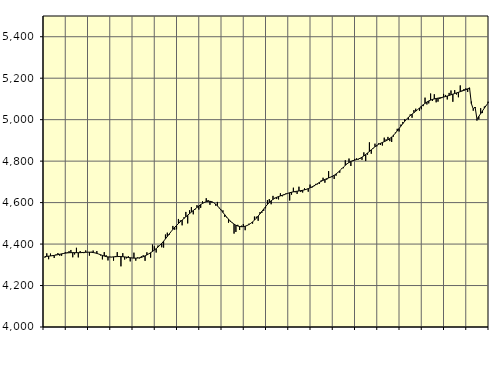
| Category | Piggar | Series 1 |
|---|---|---|
| nan | 4334.2 | 4339.69 |
| 1.0 | 4355.4 | 4340.64 |
| 1.0 | 4326.9 | 4341.66 |
| 1.0 | 4354.1 | 4342.77 |
| 1.0 | 4346.4 | 4343.97 |
| 1.0 | 4333.1 | 4345.29 |
| 1.0 | 4349.9 | 4347.05 |
| 1.0 | 4356.6 | 4348.73 |
| 1.0 | 4343.8 | 4350.78 |
| 1.0 | 4343.7 | 4352.78 |
| 1.0 | 4356.4 | 4354.63 |
| 1.0 | 4361.3 | 4356.15 |
| nan | 4360.5 | 4357.28 |
| 2.0 | 4365.7 | 4358.07 |
| 2.0 | 4371.5 | 4358.52 |
| 2.0 | 4336.2 | 4358.7 |
| 2.0 | 4349.8 | 4358.64 |
| 2.0 | 4382 | 4358.5 |
| 2.0 | 4335.7 | 4358.42 |
| 2.0 | 4366 | 4358.53 |
| 2.0 | 4361 | 4358.98 |
| 2.0 | 4356.2 | 4359.68 |
| 2.0 | 4369.2 | 4360.35 |
| 2.0 | 4361.3 | 4360.81 |
| nan | 4344.3 | 4360.84 |
| 3.0 | 4362.8 | 4360.28 |
| 3.0 | 4368.7 | 4359.13 |
| 3.0 | 4356.9 | 4357.38 |
| 3.0 | 4366.3 | 4355 |
| 3.0 | 4351.8 | 4352 |
| 3.0 | 4345 | 4348.61 |
| 3.0 | 4326.1 | 4345.21 |
| 3.0 | 4361.1 | 4342.1 |
| 3.0 | 4346.4 | 4339.65 |
| 3.0 | 4321 | 4338.04 |
| 3.0 | 4338.7 | 4337.37 |
| nan | 4336.6 | 4337.59 |
| 4.0 | 4319.8 | 4338.27 |
| 4.0 | 4342.5 | 4339.05 |
| 4.0 | 4361.2 | 4339.65 |
| 4.0 | 4338.8 | 4339.91 |
| 4.0 | 4292.6 | 4339.68 |
| 4.0 | 4356.1 | 4339.01 |
| 4.0 | 4325.3 | 4338.06 |
| 4.0 | 4331.2 | 4336.82 |
| 4.0 | 4341.5 | 4335.35 |
| 4.0 | 4316.5 | 4334.06 |
| 4.0 | 4332.6 | 4333.02 |
| nan | 4358.5 | 4332.24 |
| 5.0 | 4319.9 | 4332.03 |
| 5.0 | 4335.6 | 4332.52 |
| 5.0 | 4331.1 | 4333.72 |
| 5.0 | 4341.4 | 4335.78 |
| 5.0 | 4346.2 | 4338.94 |
| 5.0 | 4319.2 | 4342.96 |
| 5.0 | 4360.2 | 4347.56 |
| 5.0 | 4352.2 | 4352.71 |
| 5.0 | 4334.5 | 4358.34 |
| 5.0 | 4397.7 | 4364.35 |
| 5.0 | 4389.2 | 4370.87 |
| nan | 4359.3 | 4378.01 |
| 6.0 | 4393.1 | 4385.75 |
| 6.0 | 4393.9 | 4394.26 |
| 6.0 | 4384.5 | 4403.66 |
| 6.0 | 4382.9 | 4413.92 |
| 6.0 | 4446.1 | 4424.8 |
| 6.0 | 4455 | 4436.33 |
| 6.0 | 4444.4 | 4448.13 |
| 6.0 | 4459.9 | 4459.6 |
| 6.0 | 4487.4 | 4470.58 |
| 6.0 | 4469.2 | 4480.85 |
| 6.0 | 4471 | 4490.17 |
| nan | 4521.1 | 4498.87 |
| 7.0 | 4514.3 | 4507.31 |
| 7.0 | 4490.4 | 4515.5 |
| 7.0 | 4529.3 | 4523.61 |
| 7.0 | 4555 | 4531.63 |
| 7.0 | 4499.6 | 4539.42 |
| 7.0 | 4563 | 4546.91 |
| 7.0 | 4578.3 | 4554.3 |
| 7.0 | 4543.5 | 4561.73 |
| 7.0 | 4567 | 4569.19 |
| 7.0 | 4587.7 | 4576.52 |
| 7.0 | 4566.5 | 4583.65 |
| nan | 4574.8 | 4590.28 |
| 8.0 | 4606.3 | 4596.03 |
| 8.0 | 4602.5 | 4600.81 |
| 8.0 | 4621 | 4604.35 |
| 8.0 | 4612.4 | 4606.29 |
| 8.0 | 4589.3 | 4606.33 |
| 8.0 | 4600.1 | 4604.27 |
| 8.0 | 4600 | 4599.82 |
| 8.0 | 4585.8 | 4593.13 |
| 8.0 | 4603.3 | 4584.59 |
| 8.0 | 4573.1 | 4574.66 |
| 8.0 | 4565.7 | 4563.82 |
| nan | 4562.7 | 4552.57 |
| 9.0 | 4530.4 | 4541.34 |
| 9.0 | 4528.6 | 4530.44 |
| 9.0 | 4503 | 4520.19 |
| 9.0 | 4507.1 | 4510.88 |
| 9.0 | 4504.5 | 4502.85 |
| 9.0 | 4450.5 | 4496.2 |
| 9.0 | 4458.4 | 4490.91 |
| 9.0 | 4492.8 | 4487.11 |
| 9.0 | 4467.9 | 4484.73 |
| 9.0 | 4488.6 | 4483.73 |
| 9.0 | 4496.3 | 4484.2 |
| nan | 4466.8 | 4486.14 |
| 10.0 | 4489.2 | 4489.42 |
| 10.0 | 4498.1 | 4493.98 |
| 10.0 | 4500.3 | 4499.88 |
| 10.0 | 4498.6 | 4507.02 |
| 10.0 | 4532.6 | 4515.27 |
| 10.0 | 4532.1 | 4524.61 |
| 10.0 | 4512.4 | 4534.98 |
| 10.0 | 4554 | 4546.05 |
| 10.0 | 4550.7 | 4557.57 |
| 10.0 | 4560.2 | 4569.18 |
| 10.0 | 4572.7 | 4580.4 |
| nan | 4612 | 4590.88 |
| 11.0 | 4617.1 | 4600.41 |
| 11.0 | 4592 | 4608.72 |
| 11.0 | 4632.4 | 4615.62 |
| 11.0 | 4623.2 | 4621.2 |
| 11.0 | 4617.2 | 4625.69 |
| 11.0 | 4615.3 | 4629.27 |
| 11.0 | 4645 | 4632.39 |
| 11.0 | 4630.3 | 4635.45 |
| 11.0 | 4636 | 4638.48 |
| 11.0 | 4644.2 | 4641.59 |
| 11.0 | 4645.3 | 4644.73 |
| nan | 4610.2 | 4647.58 |
| 12.0 | 4638.2 | 4649.97 |
| 12.0 | 4671.8 | 4651.94 |
| 12.0 | 4649.7 | 4653.57 |
| 12.0 | 4641.9 | 4654.9 |
| 12.0 | 4676.6 | 4656.22 |
| 12.0 | 4650.9 | 4657.71 |
| 12.0 | 4648.6 | 4659.41 |
| 12.0 | 4669.2 | 4661.51 |
| 12.0 | 4662.9 | 4664.23 |
| 12.0 | 4652.6 | 4667.47 |
| 12.0 | 4686.9 | 4671.22 |
| nan | 4671.8 | 4675.55 |
| 13.0 | 4678.6 | 4680.49 |
| 13.0 | 4690.1 | 4685.94 |
| 13.0 | 4688.2 | 4691.57 |
| 13.0 | 4689.7 | 4697.22 |
| 13.0 | 4707.4 | 4702.58 |
| 13.0 | 4719.9 | 4707.42 |
| 13.0 | 4696 | 4711.69 |
| 13.0 | 4710.3 | 4715.44 |
| 13.0 | 4751.7 | 4718.85 |
| 13.0 | 4723.7 | 4722.47 |
| 13.0 | 4722.7 | 4726.73 |
| nan | 4713.8 | 4731.85 |
| 14.0 | 4729.5 | 4738.04 |
| 14.0 | 4746.3 | 4745.3 |
| 14.0 | 4744.1 | 4753.48 |
| 14.0 | 4763.7 | 4762.31 |
| 14.0 | 4765.9 | 4771.2 |
| 14.0 | 4804 | 4779.71 |
| 14.0 | 4789.5 | 4787.42 |
| 14.0 | 4812.4 | 4793.77 |
| 14.0 | 4776.7 | 4798.57 |
| 14.0 | 4799.9 | 4802.04 |
| 14.0 | 4810.7 | 4804.73 |
| nan | 4813.3 | 4807.28 |
| 15.0 | 4807.7 | 4810.23 |
| 15.0 | 4811.1 | 4814.02 |
| 15.0 | 4806.2 | 4818.98 |
| 15.0 | 4842.3 | 4825.05 |
| 15.0 | 4800.4 | 4831.95 |
| 15.0 | 4831.1 | 4839.32 |
| 15.0 | 4890.7 | 4846.9 |
| 15.0 | 4835.7 | 4854.64 |
| 15.0 | 4860.4 | 4862.27 |
| 15.0 | 4884.2 | 4869.5 |
| 15.0 | 4871.2 | 4875.87 |
| nan | 4886.1 | 4881.32 |
| 16.0 | 4878.2 | 4885.93 |
| 16.0 | 4875.2 | 4889.98 |
| 16.0 | 4913.3 | 4893.83 |
| 16.0 | 4905.1 | 4897.95 |
| 16.0 | 4916.8 | 4902.85 |
| 16.0 | 4896.3 | 4908.96 |
| 16.0 | 4892.4 | 4916.35 |
| 16.0 | 4918.5 | 4924.99 |
| 16.0 | 4937.8 | 4934.86 |
| 16.0 | 4955.9 | 4945.64 |
| 16.0 | 4943 | 4957.04 |
| nan | 4976.4 | 4968.85 |
| 17.0 | 4988.9 | 4980.61 |
| 17.0 | 5002.5 | 4991.76 |
| 17.0 | 5002.3 | 5001.94 |
| 17.0 | 5000.3 | 5011.04 |
| 17.0 | 5025.1 | 5019.12 |
| 17.0 | 5009.3 | 5026.53 |
| 17.0 | 5046.3 | 5033.67 |
| 17.0 | 5052.9 | 5040.91 |
| 17.0 | 5048.7 | 5048.42 |
| 17.0 | 5043 | 5056.23 |
| 17.0 | 5050.3 | 5064.16 |
| nan | 5065.2 | 5071.87 |
| 18.0 | 5106.2 | 5078.87 |
| 18.0 | 5073.2 | 5085.02 |
| 18.0 | 5078.5 | 5090.18 |
| 18.0 | 5126 | 5094.26 |
| 18.0 | 5090.4 | 5097.54 |
| 18.0 | 5122.5 | 5100.06 |
| 18.0 | 5083.7 | 5102.07 |
| 18.0 | 5086.9 | 5103.79 |
| 18.0 | 5099.8 | 5105.39 |
| 18.0 | 5103.7 | 5107.12 |
| 18.0 | 5124.2 | 5109.12 |
| nan | 5119.2 | 5111.4 |
| 19.0 | 5097.5 | 5113.98 |
| 19.0 | 5129 | 5116.83 |
| 19.0 | 5140.8 | 5119.92 |
| 19.0 | 5086.3 | 5123.02 |
| 19.0 | 5142.5 | 5125.98 |
| 19.0 | 5121.5 | 5128.93 |
| 19.0 | 5108.1 | 5131.93 |
| 19.0 | 5165.1 | 5134.98 |
| 19.0 | 5141.1 | 5138.09 |
| 19.0 | 5147.8 | 5141.26 |
| 19.0 | 5150.9 | 5144.67 |
| nan | 5133.7 | 5148.59 |
| 20.0 | 5146.2 | 5153.46 |
| 20.0 | 5087.2 | 5077.27 |
| 20.0 | 5043.3 | 5051.4 |
| 20.0 | 5056.7 | 5060.92 |
| 20.0 | 4995.6 | 5003.15 |
| 20.0 | 5001.4 | 5015.7 |
| 20.0 | 5055.5 | 5029.1 |
| 20.0 | 5031.9 | 5042.7 |
| 20.0 | 5063.5 | 5055.85 |
| 20.0 | 5069.3 | 5068.27 |
| 20.0 | 5086.7 | 5079.72 |